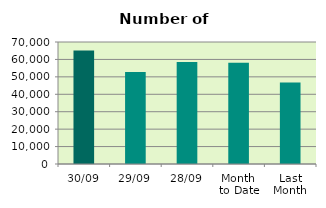
| Category | Series 0 |
|---|---|
| 30/09 | 65108 |
| 29/09 | 52794 |
| 28/09 | 58464 |
| Month 
to Date | 58072.091 |
| Last
Month | 46763.238 |